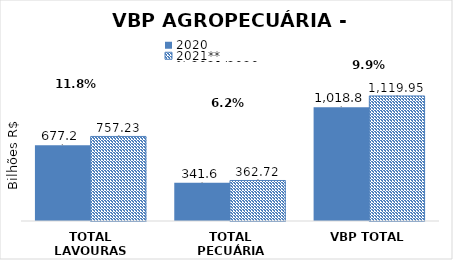
| Category | 2020 | 2021** |
|---|---|---|
| TOTAL LAVOURAS | 677.247 | 757.227 |
| TOTAL PECUÁRIA | 341.596 | 362.719 |
| VBP TOTAL | 1018.843 | 1119.947 |